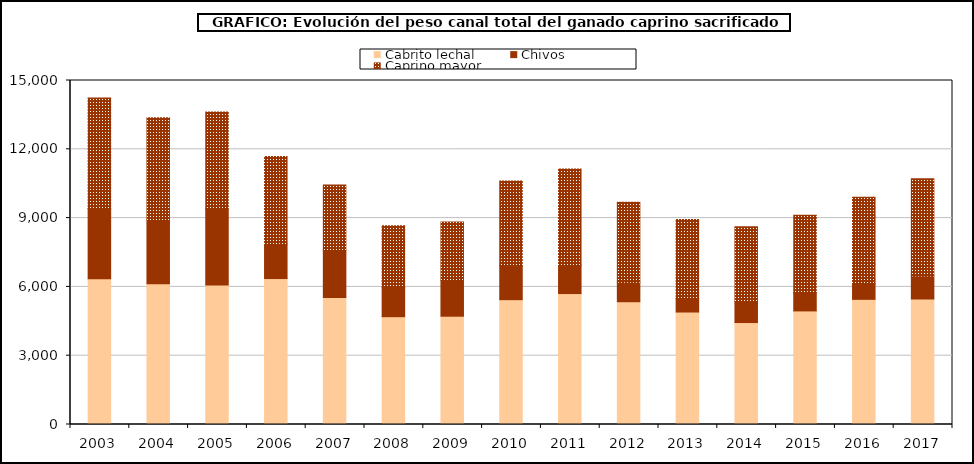
| Category | Cabrito lechal | Chivos | Caprino mayor |
|---|---|---|---|
| 2003.0 | 6354.4 | 3060.7 | 4824.6 |
| 2004.0 | 6133.147 | 2794.229 | 4446.039 |
| 2005.0 | 6081.5 | 3326.197 | 4213.791 |
| 2006.0 | 6363.804 | 1514.071 | 3812.237 |
| 2007.0 | 5538.187 | 2055.519 | 2852.212 |
| 2008.0 | 4700.787 | 1279.039 | 2682.444 |
| 2009.0 | 4721.591 | 1569.493 | 2539.825 |
| 2010.0 | 5443.269 | 1481.101 | 3693.873 |
| 2011.0 | 5709.183 | 1237.105 | 4195.759 |
| 2012.0 | 5353.402 | 854.156 | 3488.702 |
| 2013.0 | 4904.881 | 592.234 | 3442.821 |
| 2014.0 | 4445.773 | 905.526 | 3270.219 |
| 2015.0 | 4952.564 | 787.441 | 3379.656 |
| 2016.0 | 5457.161 | 675.571 | 3771.302 |
| 2017.0 | 5472.065 | 1000.592 | 4240.75 |